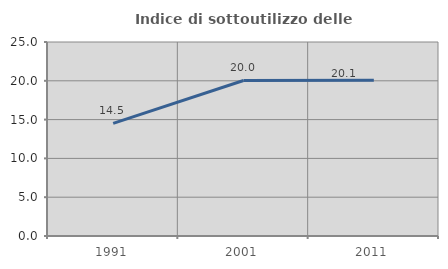
| Category | Indice di sottoutilizzo delle abitazioni  |
|---|---|
| 1991.0 | 14.521 |
| 2001.0 | 20.044 |
| 2011.0 | 20.085 |